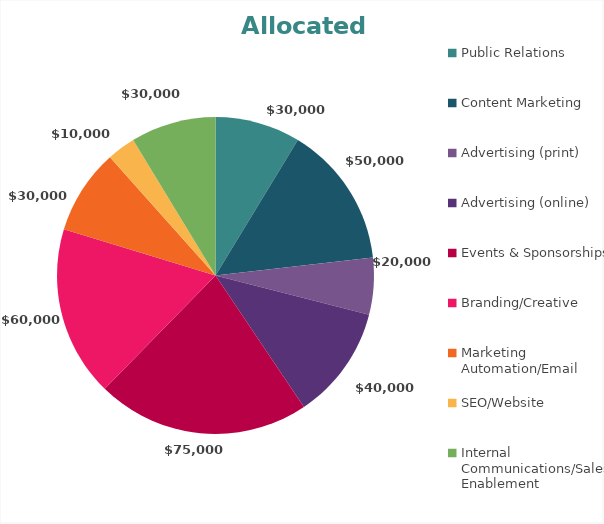
| Category | Series 1 |
|---|---|
| Public Relations | 30000 |
| Content Marketing | 50000 |
| Advertising (print) | 20000 |
| Advertising (online) | 40000 |
| Events & Sponsorships | 75000 |
| Branding/Creative | 60000 |
| Marketing Automation/Email | 30000 |
| SEO/Website | 10000 |
| Internal Communications/Sales Enablement | 30000 |